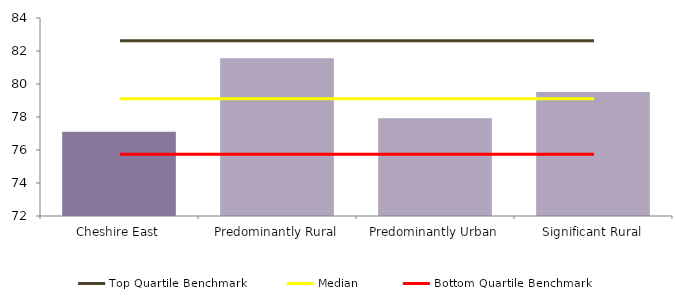
| Category | Series 0 |
|---|---|
| Cheshire East | 77.112 |
| Predominantly Rural | 81.561 |
| Predominantly Urban | 77.93 |
| Significant Rural | 79.509 |